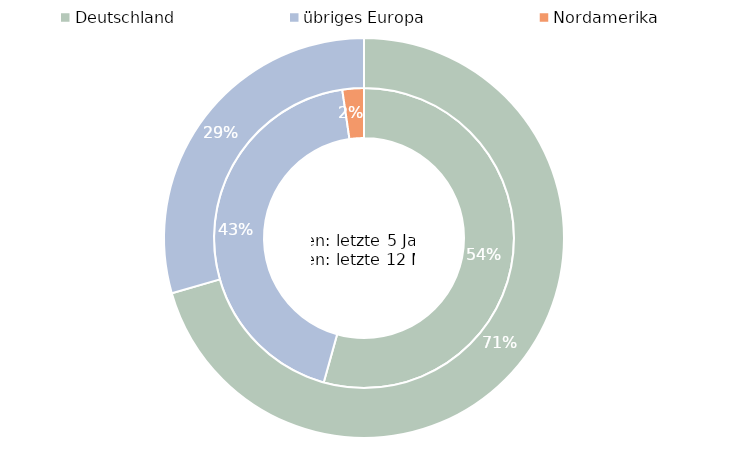
| Category | letzte 5 Jahre | letzte 12 Monate |
|---|---|---|
| Deutschland | 1560136815.298 | 0.705 |
| übriges Europa | 1244972992.552 | 0.295 |
| Nordamerika | 66527086.064 | 0 |